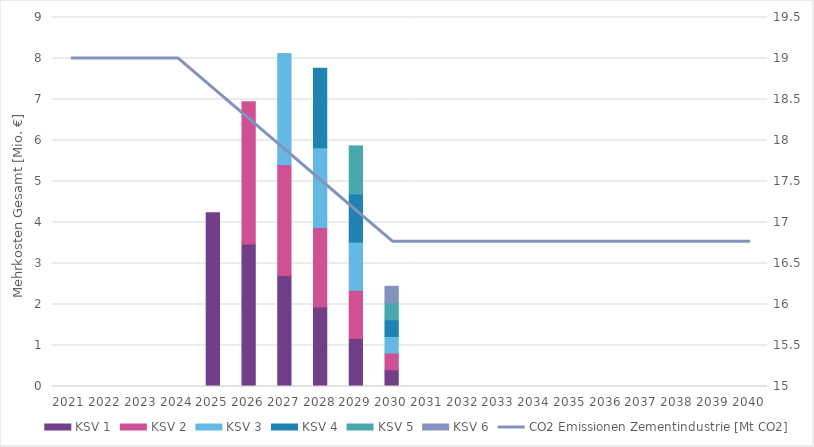
| Category | KSV 1 | KSV 2 | KSV 3 | KSV 4 | KSV 5 | KSV 6 |
|---|---|---|---|---|---|---|
| 0 | 0 | 0 | 0 | 0 | 0 | 0 |
| 1 | 0 | 0 | 0 | 0 | 0 | 0 |
| 2 | 0 | 0 | 0 | 0 | 0 | 0 |
| 3 | 0 | 0 | 0 | 0 | 0 | 0 |
| 4 | 4.24 | 0 | 0 | 0 | 0 | 0 |
| 5 | 3.474 | 3.474 | 0 | 0 | 0 | 0 |
| 6 | 2.707 | 2.707 | 2.707 | 0 | 0 | 0 |
| 7 | 1.94 | 1.94 | 1.94 | 1.94 | 0 | 0 |
| 8 | 1.174 | 1.174 | 1.174 | 1.174 | 1.174 | 0 |
| 9 | 0.407 | 0.407 | 0.407 | 0.407 | 0.407 | 0.407 |
| 10 | 0 | 0 | 0 | 0 | 0 | 0 |
| 11 | 0 | 0 | 0 | 0 | 0 | 0 |
| 12 | 0 | 0 | 0 | 0 | 0 | 0 |
| 13 | 0 | 0 | 0 | 0 | 0 | 0 |
| 14 | 0 | 0 | 0 | 0 | 0 | 0 |
| 15 | 0 | 0 | 0 | 0 | 0 | 0 |
| 16 | 0 | 0 | 0 | 0 | 0 | 0 |
| 17 | 0 | 0 | 0 | 0 | 0 | 0 |
| 18 | 0 | 0 | 0 | 0 | 0 | 0 |
| 19 | 0 | 0 | 0 | 0 | 0 | 0 |